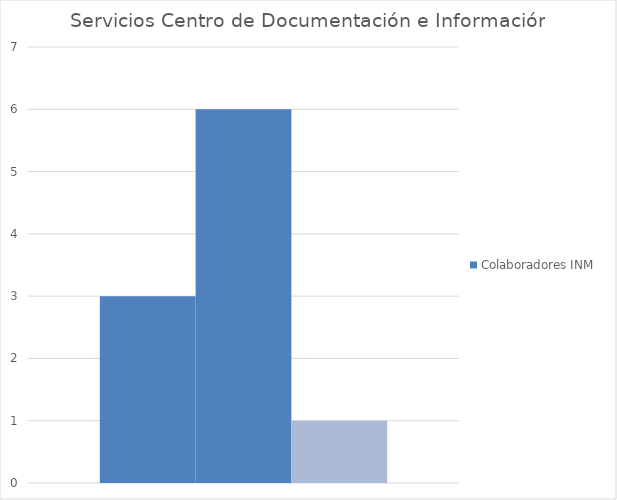
| Category | Colaboradores INM  | Investigadores Externos | Doctorado |
|---|---|---|---|
| 0 | 3 | 6 | 1 |